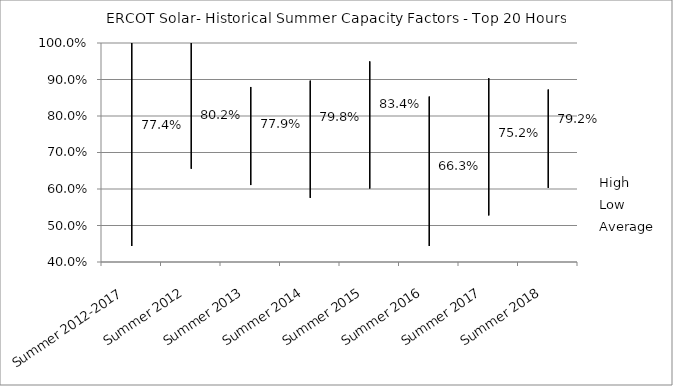
| Category | High | Low | Average |
|---|---|---|---|
| Summer 2012-2017 | 1 | 0.444 | 0.774 |
| Summer 2012 | 1 | 0.655 | 0.802 |
| Summer 2013 | 0.88 | 0.611 | 0.779 |
| Summer 2014 | 0.897 | 0.576 | 0.798 |
| Summer 2015 | 0.95 | 0.601 | 0.834 |
| Summer 2016 | 0.853 | 0.444 | 0.663 |
| Summer 2017 | 0.904 | 0.528 | 0.752 |
| Summer 2018 | 0.872 | 0.603 | 0.792 |